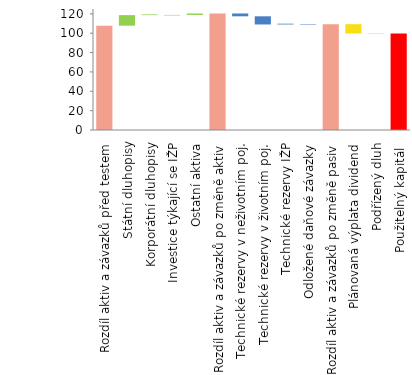
| Category | Series 0 | Series 1 |
|---|---|---|
| Rozdíl aktiv a závazků před testem | 107.78 | 0 |
| Státní dluhopisy | 107.78 | 10.88 |
| Korporátní dluhopisy | 118.65 | 0.76 |
| Investice týkající se IŽP | 118.34 | 0.54 |
| Ostatní aktiva | 118.88 | 1.5 |
| Rozdíl aktiv a závazků po změně aktiv | 0 | 120.38 |
| Technické rezervy v neživotním poj. | 117.46 | 2.92 |
| Technické rezervy v životním poj. | 109.02 | 8.44 |
| Technické rezervy IŽP | 109.02 | 0.79 |
| Odložené daňové závazky | 108.85 | 0.48 |
| Rozdíl aktiv a závazků po změně pasiv | 0 | 109.33 |
| Plánovaná výplata dividend | 99.69 | 9.63 |
| Podřízený dluh | 99.14 | 0.56 |
| Použitelný kapitál  | 0 | 99.69 |